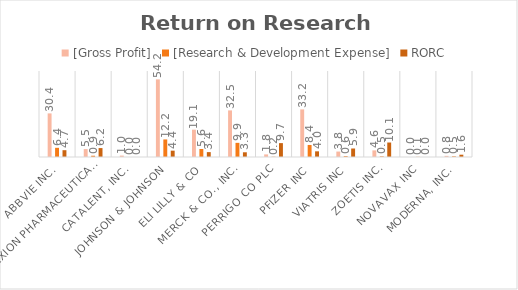
| Category | [Gross Profit] | [Research & Development Expense] | RORC |
|---|---|---|---|
| AbbVie Inc. | 30.417 | 6.407 | 4.747 |
| ALEXION PHARMACEUTICALS, INC. | 5.516 | 0.886 | 6.226 |
| Catalent, Inc. | 0.983 | 0 | 0 |
| JOHNSON & JOHNSON | 54.157 | 12.245 | 4.423 |
| ELI LILLY & Co | 19.056 | 5.595 | 3.406 |
| Merck & Co., Inc. | 32.509 | 9.872 | 3.293 |
| PERRIGO Co plc | 1.815 | 0.187 | 9.686 |
| PFIZER INC | 33.216 | 8.394 | 3.957 |
| Viatris Inc | 3.797 | 0.64 | 5.933 |
| Zoetis Inc. | 4.618 | 0.457 | 10.105 |
| NOVAVAX INC | 0 | 0.114 | 0 |
| Moderna, Inc. | 0.795 | 0.496 | 1.603 |